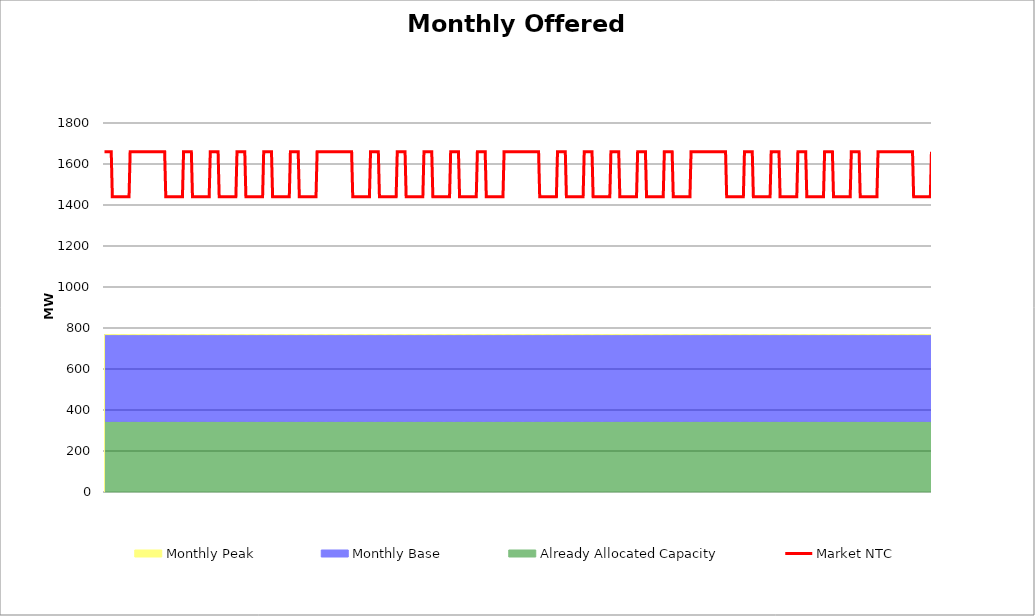
| Category | Market NTC |
|---|---|
| 0 | 1660 |
| 1 | 1660 |
| 2 | 1660 |
| 3 | 1660 |
| 4 | 1660 |
| 5 | 1660 |
| 6 | 1660 |
| 7 | 1440 |
| 8 | 1440 |
| 9 | 1440 |
| 10 | 1440 |
| 11 | 1440 |
| 12 | 1440 |
| 13 | 1440 |
| 14 | 1440 |
| 15 | 1440 |
| 16 | 1440 |
| 17 | 1440 |
| 18 | 1440 |
| 19 | 1440 |
| 20 | 1440 |
| 21 | 1440 |
| 22 | 1440 |
| 23 | 1660 |
| 24 | 1660 |
| 25 | 1660 |
| 26 | 1660 |
| 27 | 1660 |
| 28 | 1660 |
| 29 | 1660 |
| 30 | 1660 |
| 31 | 1660 |
| 32 | 1660 |
| 33 | 1660 |
| 34 | 1660 |
| 35 | 1660 |
| 36 | 1660 |
| 37 | 1660 |
| 38 | 1660 |
| 39 | 1660 |
| 40 | 1660 |
| 41 | 1660 |
| 42 | 1660 |
| 43 | 1660 |
| 44 | 1660 |
| 45 | 1660 |
| 46 | 1660 |
| 47 | 1660 |
| 48 | 1660 |
| 49 | 1660 |
| 50 | 1660 |
| 51 | 1660 |
| 52 | 1660 |
| 53 | 1660 |
| 54 | 1660 |
| 55 | 1440 |
| 56 | 1440 |
| 57 | 1440 |
| 58 | 1440 |
| 59 | 1440 |
| 60 | 1440 |
| 61 | 1440 |
| 62 | 1440 |
| 63 | 1440 |
| 64 | 1440 |
| 65 | 1440 |
| 66 | 1440 |
| 67 | 1440 |
| 68 | 1440 |
| 69 | 1440 |
| 70 | 1440 |
| 71 | 1660 |
| 72 | 1660 |
| 73 | 1660 |
| 74 | 1660 |
| 75 | 1660 |
| 76 | 1660 |
| 77 | 1660 |
| 78 | 1660 |
| 79 | 1440 |
| 80 | 1440 |
| 81 | 1440 |
| 82 | 1440 |
| 83 | 1440 |
| 84 | 1440 |
| 85 | 1440 |
| 86 | 1440 |
| 87 | 1440 |
| 88 | 1440 |
| 89 | 1440 |
| 90 | 1440 |
| 91 | 1440 |
| 92 | 1440 |
| 93 | 1440 |
| 94 | 1440 |
| 95 | 1660 |
| 96 | 1660 |
| 97 | 1660 |
| 98 | 1660 |
| 99 | 1660 |
| 100 | 1660 |
| 101 | 1660 |
| 102 | 1660 |
| 103 | 1440 |
| 104 | 1440 |
| 105 | 1440 |
| 106 | 1440 |
| 107 | 1440 |
| 108 | 1440 |
| 109 | 1440 |
| 110 | 1440 |
| 111 | 1440 |
| 112 | 1440 |
| 113 | 1440 |
| 114 | 1440 |
| 115 | 1440 |
| 116 | 1440 |
| 117 | 1440 |
| 118 | 1440 |
| 119 | 1660 |
| 120 | 1660 |
| 121 | 1660 |
| 122 | 1660 |
| 123 | 1660 |
| 124 | 1660 |
| 125 | 1660 |
| 126 | 1660 |
| 127 | 1440 |
| 128 | 1440 |
| 129 | 1440 |
| 130 | 1440 |
| 131 | 1440 |
| 132 | 1440 |
| 133 | 1440 |
| 134 | 1440 |
| 135 | 1440 |
| 136 | 1440 |
| 137 | 1440 |
| 138 | 1440 |
| 139 | 1440 |
| 140 | 1440 |
| 141 | 1440 |
| 142 | 1440 |
| 143 | 1660 |
| 144 | 1660 |
| 145 | 1660 |
| 146 | 1660 |
| 147 | 1660 |
| 148 | 1660 |
| 149 | 1660 |
| 150 | 1660 |
| 151 | 1440 |
| 152 | 1440 |
| 153 | 1440 |
| 154 | 1440 |
| 155 | 1440 |
| 156 | 1440 |
| 157 | 1440 |
| 158 | 1440 |
| 159 | 1440 |
| 160 | 1440 |
| 161 | 1440 |
| 162 | 1440 |
| 163 | 1440 |
| 164 | 1440 |
| 165 | 1440 |
| 166 | 1440 |
| 167 | 1660 |
| 168 | 1660 |
| 169 | 1660 |
| 170 | 1660 |
| 171 | 1660 |
| 172 | 1660 |
| 173 | 1660 |
| 174 | 1660 |
| 175 | 1440 |
| 176 | 1440 |
| 177 | 1440 |
| 178 | 1440 |
| 179 | 1440 |
| 180 | 1440 |
| 181 | 1440 |
| 182 | 1440 |
| 183 | 1440 |
| 184 | 1440 |
| 185 | 1440 |
| 186 | 1440 |
| 187 | 1440 |
| 188 | 1440 |
| 189 | 1440 |
| 190 | 1440 |
| 191 | 1660 |
| 192 | 1660 |
| 193 | 1660 |
| 194 | 1660 |
| 195 | 1660 |
| 196 | 1660 |
| 197 | 1660 |
| 198 | 1660 |
| 199 | 1660 |
| 200 | 1660 |
| 201 | 1660 |
| 202 | 1660 |
| 203 | 1660 |
| 204 | 1660 |
| 205 | 1660 |
| 206 | 1660 |
| 207 | 1660 |
| 208 | 1660 |
| 209 | 1660 |
| 210 | 1660 |
| 211 | 1660 |
| 212 | 1660 |
| 213 | 1660 |
| 214 | 1660 |
| 215 | 1660 |
| 216 | 1660 |
| 217 | 1660 |
| 218 | 1660 |
| 219 | 1660 |
| 220 | 1660 |
| 221 | 1660 |
| 222 | 1660 |
| 223 | 1440 |
| 224 | 1440 |
| 225 | 1440 |
| 226 | 1440 |
| 227 | 1440 |
| 228 | 1440 |
| 229 | 1440 |
| 230 | 1440 |
| 231 | 1440 |
| 232 | 1440 |
| 233 | 1440 |
| 234 | 1440 |
| 235 | 1440 |
| 236 | 1440 |
| 237 | 1440 |
| 238 | 1440 |
| 239 | 1660 |
| 240 | 1660 |
| 241 | 1660 |
| 242 | 1660 |
| 243 | 1660 |
| 244 | 1660 |
| 245 | 1660 |
| 246 | 1660 |
| 247 | 1440 |
| 248 | 1440 |
| 249 | 1440 |
| 250 | 1440 |
| 251 | 1440 |
| 252 | 1440 |
| 253 | 1440 |
| 254 | 1440 |
| 255 | 1440 |
| 256 | 1440 |
| 257 | 1440 |
| 258 | 1440 |
| 259 | 1440 |
| 260 | 1440 |
| 261 | 1440 |
| 262 | 1440 |
| 263 | 1660 |
| 264 | 1660 |
| 265 | 1660 |
| 266 | 1660 |
| 267 | 1660 |
| 268 | 1660 |
| 269 | 1660 |
| 270 | 1660 |
| 271 | 1440 |
| 272 | 1440 |
| 273 | 1440 |
| 274 | 1440 |
| 275 | 1440 |
| 276 | 1440 |
| 277 | 1440 |
| 278 | 1440 |
| 279 | 1440 |
| 280 | 1440 |
| 281 | 1440 |
| 282 | 1440 |
| 283 | 1440 |
| 284 | 1440 |
| 285 | 1440 |
| 286 | 1440 |
| 287 | 1660 |
| 288 | 1660 |
| 289 | 1660 |
| 290 | 1660 |
| 291 | 1660 |
| 292 | 1660 |
| 293 | 1660 |
| 294 | 1660 |
| 295 | 1440 |
| 296 | 1440 |
| 297 | 1440 |
| 298 | 1440 |
| 299 | 1440 |
| 300 | 1440 |
| 301 | 1440 |
| 302 | 1440 |
| 303 | 1440 |
| 304 | 1440 |
| 305 | 1440 |
| 306 | 1440 |
| 307 | 1440 |
| 308 | 1440 |
| 309 | 1440 |
| 310 | 1440 |
| 311 | 1660 |
| 312 | 1660 |
| 313 | 1660 |
| 314 | 1660 |
| 315 | 1660 |
| 316 | 1660 |
| 317 | 1660 |
| 318 | 1660 |
| 319 | 1440 |
| 320 | 1440 |
| 321 | 1440 |
| 322 | 1440 |
| 323 | 1440 |
| 324 | 1440 |
| 325 | 1440 |
| 326 | 1440 |
| 327 | 1440 |
| 328 | 1440 |
| 329 | 1440 |
| 330 | 1440 |
| 331 | 1440 |
| 332 | 1440 |
| 333 | 1440 |
| 334 | 1440 |
| 335 | 1660 |
| 336 | 1660 |
| 337 | 1660 |
| 338 | 1660 |
| 339 | 1660 |
| 340 | 1660 |
| 341 | 1660 |
| 342 | 1660 |
| 343 | 1440 |
| 344 | 1440 |
| 345 | 1440 |
| 346 | 1440 |
| 347 | 1440 |
| 348 | 1440 |
| 349 | 1440 |
| 350 | 1440 |
| 351 | 1440 |
| 352 | 1440 |
| 353 | 1440 |
| 354 | 1440 |
| 355 | 1440 |
| 356 | 1440 |
| 357 | 1440 |
| 358 | 1440 |
| 359 | 1660 |
| 360 | 1660 |
| 361 | 1660 |
| 362 | 1660 |
| 363 | 1660 |
| 364 | 1660 |
| 365 | 1660 |
| 366 | 1660 |
| 367 | 1660 |
| 368 | 1660 |
| 369 | 1660 |
| 370 | 1660 |
| 371 | 1660 |
| 372 | 1660 |
| 373 | 1660 |
| 374 | 1660 |
| 375 | 1660 |
| 376 | 1660 |
| 377 | 1660 |
| 378 | 1660 |
| 379 | 1660 |
| 380 | 1660 |
| 381 | 1660 |
| 382 | 1660 |
| 383 | 1660 |
| 384 | 1660 |
| 385 | 1660 |
| 386 | 1660 |
| 387 | 1660 |
| 388 | 1660 |
| 389 | 1660 |
| 390 | 1660 |
| 391 | 1440 |
| 392 | 1440 |
| 393 | 1440 |
| 394 | 1440 |
| 395 | 1440 |
| 396 | 1440 |
| 397 | 1440 |
| 398 | 1440 |
| 399 | 1440 |
| 400 | 1440 |
| 401 | 1440 |
| 402 | 1440 |
| 403 | 1440 |
| 404 | 1440 |
| 405 | 1440 |
| 406 | 1440 |
| 407 | 1660 |
| 408 | 1660 |
| 409 | 1660 |
| 410 | 1660 |
| 411 | 1660 |
| 412 | 1660 |
| 413 | 1660 |
| 414 | 1660 |
| 415 | 1440 |
| 416 | 1440 |
| 417 | 1440 |
| 418 | 1440 |
| 419 | 1440 |
| 420 | 1440 |
| 421 | 1440 |
| 422 | 1440 |
| 423 | 1440 |
| 424 | 1440 |
| 425 | 1440 |
| 426 | 1440 |
| 427 | 1440 |
| 428 | 1440 |
| 429 | 1440 |
| 430 | 1440 |
| 431 | 1660 |
| 432 | 1660 |
| 433 | 1660 |
| 434 | 1660 |
| 435 | 1660 |
| 436 | 1660 |
| 437 | 1660 |
| 438 | 1660 |
| 439 | 1440 |
| 440 | 1440 |
| 441 | 1440 |
| 442 | 1440 |
| 443 | 1440 |
| 444 | 1440 |
| 445 | 1440 |
| 446 | 1440 |
| 447 | 1440 |
| 448 | 1440 |
| 449 | 1440 |
| 450 | 1440 |
| 451 | 1440 |
| 452 | 1440 |
| 453 | 1440 |
| 454 | 1440 |
| 455 | 1660 |
| 456 | 1660 |
| 457 | 1660 |
| 458 | 1660 |
| 459 | 1660 |
| 460 | 1660 |
| 461 | 1660 |
| 462 | 1660 |
| 463 | 1440 |
| 464 | 1440 |
| 465 | 1440 |
| 466 | 1440 |
| 467 | 1440 |
| 468 | 1440 |
| 469 | 1440 |
| 470 | 1440 |
| 471 | 1440 |
| 472 | 1440 |
| 473 | 1440 |
| 474 | 1440 |
| 475 | 1440 |
| 476 | 1440 |
| 477 | 1440 |
| 478 | 1440 |
| 479 | 1660 |
| 480 | 1660 |
| 481 | 1660 |
| 482 | 1660 |
| 483 | 1660 |
| 484 | 1660 |
| 485 | 1660 |
| 486 | 1660 |
| 487 | 1440 |
| 488 | 1440 |
| 489 | 1440 |
| 490 | 1440 |
| 491 | 1440 |
| 492 | 1440 |
| 493 | 1440 |
| 494 | 1440 |
| 495 | 1440 |
| 496 | 1440 |
| 497 | 1440 |
| 498 | 1440 |
| 499 | 1440 |
| 500 | 1440 |
| 501 | 1440 |
| 502 | 1440 |
| 503 | 1660 |
| 504 | 1660 |
| 505 | 1660 |
| 506 | 1660 |
| 507 | 1660 |
| 508 | 1660 |
| 509 | 1660 |
| 510 | 1660 |
| 511 | 1440 |
| 512 | 1440 |
| 513 | 1440 |
| 514 | 1440 |
| 515 | 1440 |
| 516 | 1440 |
| 517 | 1440 |
| 518 | 1440 |
| 519 | 1440 |
| 520 | 1440 |
| 521 | 1440 |
| 522 | 1440 |
| 523 | 1440 |
| 524 | 1440 |
| 525 | 1440 |
| 526 | 1440 |
| 527 | 1660 |
| 528 | 1660 |
| 529 | 1660 |
| 530 | 1660 |
| 531 | 1660 |
| 532 | 1660 |
| 533 | 1660 |
| 534 | 1660 |
| 535 | 1660 |
| 536 | 1660 |
| 537 | 1660 |
| 538 | 1660 |
| 539 | 1660 |
| 540 | 1660 |
| 541 | 1660 |
| 542 | 1660 |
| 543 | 1660 |
| 544 | 1660 |
| 545 | 1660 |
| 546 | 1660 |
| 547 | 1660 |
| 548 | 1660 |
| 549 | 1660 |
| 550 | 1660 |
| 551 | 1660 |
| 552 | 1660 |
| 553 | 1660 |
| 554 | 1660 |
| 555 | 1660 |
| 556 | 1660 |
| 557 | 1660 |
| 558 | 1660 |
| 559 | 1440 |
| 560 | 1440 |
| 561 | 1440 |
| 562 | 1440 |
| 563 | 1440 |
| 564 | 1440 |
| 565 | 1440 |
| 566 | 1440 |
| 567 | 1440 |
| 568 | 1440 |
| 569 | 1440 |
| 570 | 1440 |
| 571 | 1440 |
| 572 | 1440 |
| 573 | 1440 |
| 574 | 1440 |
| 575 | 1660 |
| 576 | 1660 |
| 577 | 1660 |
| 578 | 1660 |
| 579 | 1660 |
| 580 | 1660 |
| 581 | 1660 |
| 582 | 1660 |
| 583 | 1440 |
| 584 | 1440 |
| 585 | 1440 |
| 586 | 1440 |
| 587 | 1440 |
| 588 | 1440 |
| 589 | 1440 |
| 590 | 1440 |
| 591 | 1440 |
| 592 | 1440 |
| 593 | 1440 |
| 594 | 1440 |
| 595 | 1440 |
| 596 | 1440 |
| 597 | 1440 |
| 598 | 1440 |
| 599 | 1660 |
| 600 | 1660 |
| 601 | 1660 |
| 602 | 1660 |
| 603 | 1660 |
| 604 | 1660 |
| 605 | 1660 |
| 606 | 1660 |
| 607 | 1440 |
| 608 | 1440 |
| 609 | 1440 |
| 610 | 1440 |
| 611 | 1440 |
| 612 | 1440 |
| 613 | 1440 |
| 614 | 1440 |
| 615 | 1440 |
| 616 | 1440 |
| 617 | 1440 |
| 618 | 1440 |
| 619 | 1440 |
| 620 | 1440 |
| 621 | 1440 |
| 622 | 1440 |
| 623 | 1660 |
| 624 | 1660 |
| 625 | 1660 |
| 626 | 1660 |
| 627 | 1660 |
| 628 | 1660 |
| 629 | 1660 |
| 630 | 1660 |
| 631 | 1440 |
| 632 | 1440 |
| 633 | 1440 |
| 634 | 1440 |
| 635 | 1440 |
| 636 | 1440 |
| 637 | 1440 |
| 638 | 1440 |
| 639 | 1440 |
| 640 | 1440 |
| 641 | 1440 |
| 642 | 1440 |
| 643 | 1440 |
| 644 | 1440 |
| 645 | 1440 |
| 646 | 1440 |
| 647 | 1660 |
| 648 | 1660 |
| 649 | 1660 |
| 650 | 1660 |
| 651 | 1660 |
| 652 | 1660 |
| 653 | 1660 |
| 654 | 1660 |
| 655 | 1440 |
| 656 | 1440 |
| 657 | 1440 |
| 658 | 1440 |
| 659 | 1440 |
| 660 | 1440 |
| 661 | 1440 |
| 662 | 1440 |
| 663 | 1440 |
| 664 | 1440 |
| 665 | 1440 |
| 666 | 1440 |
| 667 | 1440 |
| 668 | 1440 |
| 669 | 1440 |
| 670 | 1440 |
| 671 | 1660 |
| 672 | 1660 |
| 673 | 1660 |
| 674 | 1660 |
| 675 | 1660 |
| 676 | 1660 |
| 677 | 1660 |
| 678 | 1660 |
| 679 | 1440 |
| 680 | 1440 |
| 681 | 1440 |
| 682 | 1440 |
| 683 | 1440 |
| 684 | 1440 |
| 685 | 1440 |
| 686 | 1440 |
| 687 | 1440 |
| 688 | 1440 |
| 689 | 1440 |
| 690 | 1440 |
| 691 | 1440 |
| 692 | 1440 |
| 693 | 1440 |
| 694 | 1440 |
| 695 | 1660 |
| 696 | 1660 |
| 697 | 1660 |
| 698 | 1660 |
| 699 | 1660 |
| 700 | 1660 |
| 701 | 1660 |
| 702 | 1660 |
| 703 | 1660 |
| 704 | 1660 |
| 705 | 1660 |
| 706 | 1660 |
| 707 | 1660 |
| 708 | 1660 |
| 709 | 1660 |
| 710 | 1660 |
| 711 | 1660 |
| 712 | 1660 |
| 713 | 1660 |
| 714 | 1660 |
| 715 | 1660 |
| 716 | 1660 |
| 717 | 1660 |
| 718 | 1660 |
| 719 | 1660 |
| 720 | 1660 |
| 721 | 1660 |
| 722 | 1660 |
| 723 | 1660 |
| 724 | 1660 |
| 725 | 1660 |
| 726 | 1660 |
| 727 | 1440 |
| 728 | 1440 |
| 729 | 1440 |
| 730 | 1440 |
| 731 | 1440 |
| 732 | 1440 |
| 733 | 1440 |
| 734 | 1440 |
| 735 | 1440 |
| 736 | 1440 |
| 737 | 1440 |
| 738 | 1440 |
| 739 | 1440 |
| 740 | 1440 |
| 741 | 1440 |
| 742 | 1440 |
| 743 | 1660 |